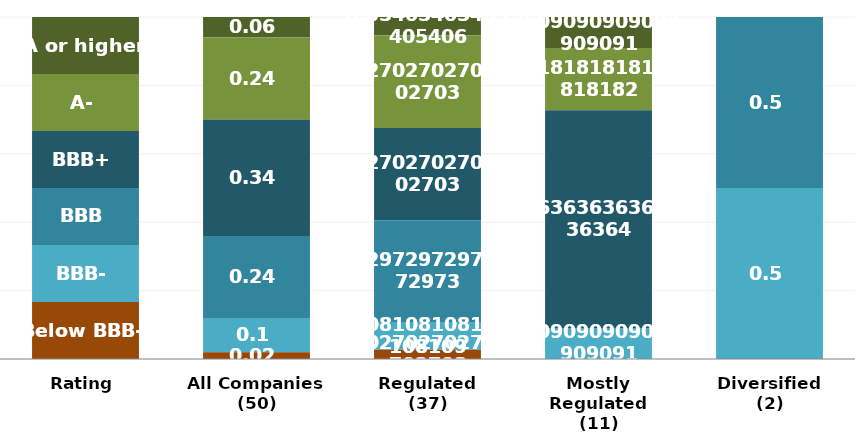
| Category | A or higher | A- | BBB+ | BBB | BBB- | Below BBB- |
|---|---|---|---|---|---|---|
| Rating | 1 | 1 | 1 | 1 | 1 | 1 |
| All Companies
(50) | 3 | 12 | 17 | 12 | 5 | 1 |
| Regulated
(37) | 2 | 10 | 10 | 11 | 3 | 1 |
| Mostly Regulated
(11) | 1 | 2 | 7 | 0 | 1 | 0 |
| Diversified
(2) | 0 | 0 | 0 | 1 | 1 | 0 |